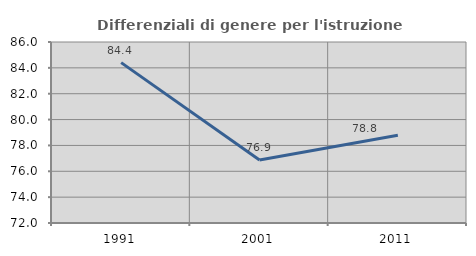
| Category | Differenziali di genere per l'istruzione superiore |
|---|---|
| 1991.0 | 84.406 |
| 2001.0 | 76.875 |
| 2011.0 | 78.793 |